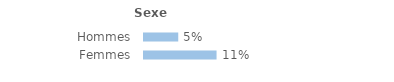
| Category | Series 0 |
|---|---|
| Hommes | 0.051 |
| Femmes | 0.108 |